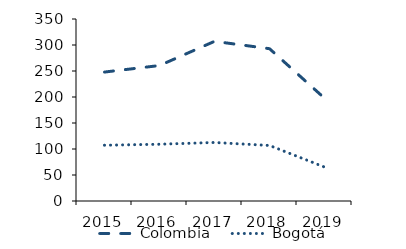
| Category | Colombia |
|---|---|
| 2015.0 | 247.959 |
| 2016.0 | 260.515 |
| 2017.0 | 307.014 |
| 2018.0 | 292.903 |
| 2019.0 | 197.684 |